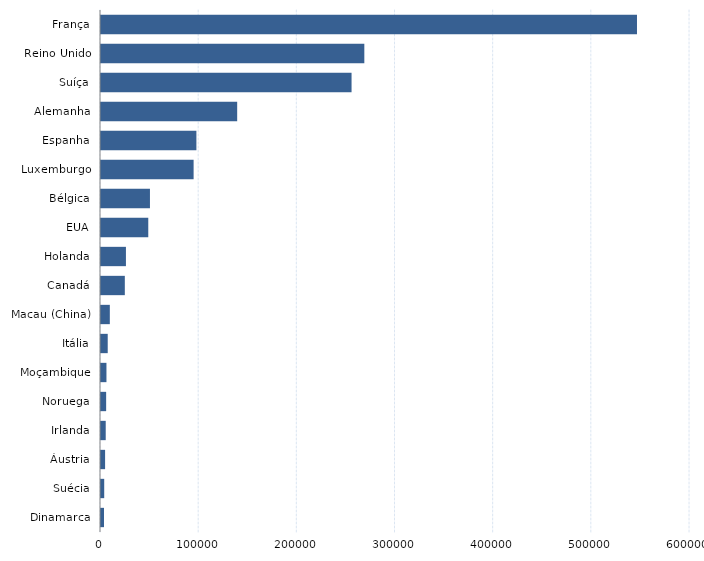
| Category | Series 0 |
|---|---|
| Dinamarca | 3069 |
| Suécia | 3275 |
| Áustria | 4172 |
| Irlanda | 4807 |
| Noruega | 5249 |
| Moçambique | 5560 |
| Itália | 6847 |
| Macau (China) | 8991 |
| Canadá | 24270 |
| Holanda | 25401 |
| EUA | 48158 |
| Bélgica | 49861 |
| Luxemburgo | 94335 |
| Espanha | 97187 |
| Alemanha | 138730 |
| Suíça | 255236 |
| Reino Unido | 268245 |
| França | 546000 |